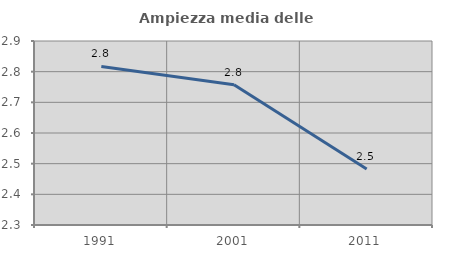
| Category | Ampiezza media delle famiglie |
|---|---|
| 1991.0 | 2.817 |
| 2001.0 | 2.757 |
| 2011.0 | 2.482 |